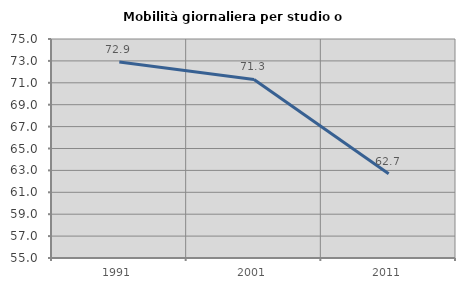
| Category | Mobilità giornaliera per studio o lavoro |
|---|---|
| 1991.0 | 72.896 |
| 2001.0 | 71.307 |
| 2011.0 | 62.698 |